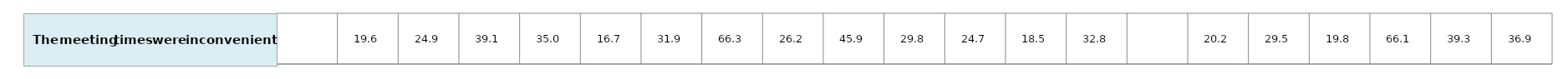
| Category | Series 0 |
|---|---|
| nan | 1 |
| 19.55142691503737 | 1 |
| 24.90082640280354 | 1 |
| 39.07673127938461 | 1 |
| 34.98683468077071 | 1 |
| 16.67381499527325 | 1 |
| 31.88686633232342 | 1 |
| 66.29334873763571 | 1 |
| 26.20173547264003 | 1 |
| 45.94389014181282 | 1 |
| 29.81050119172282 | 1 |
| 24.69863034760544 | 1 |
| 18.49086688928347 | 1 |
| 32.79333536493006 | 1 |
| nan | 1 |
| 20.181684993554548 | 1 |
| 29.47214417150561 | 1 |
| 19.80495744179547 | 1 |
| 66.09558600524909 | 1 |
| 39.34550264703806 | 1 |
| 36.86468792330503 | 1 |